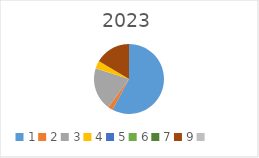
| Category | Series 0 |
|---|---|
| 1.0 | 7030612 |
| 2.0 | 276000 |
| 3.0 | 2410296 |
| 4.0 | 440000 |
| 5.0 | 0 |
| 6.0 | 0 |
| 7.0 | 0 |
| 9.0 | 2001000 |
| nan | 0 |